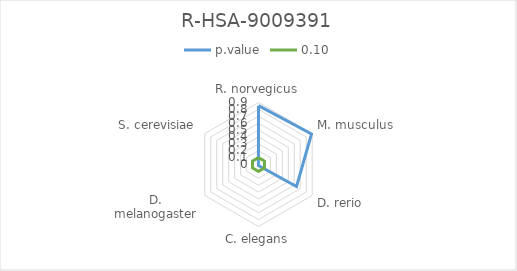
| Category | p.value | 0.10 |
|---|---|---|
| R. norvegicus | 0.854 | 0.1 |
| M. musculus | 0.888 | 0.1 |
| D. rerio | 0.637 | 0.1 |
| C. elegans | 0.015 | 0.1 |
| D. melanogaster | 0.007 | 0.1 |
| S. cerevisiae | 0.001 | 0.1 |